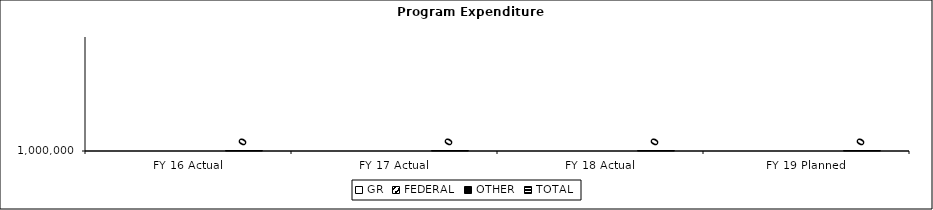
| Category | GR | FEDERAL | OTHER | TOTAL |
|---|---|---|---|---|
| FY 16 Actual |  |  |  | 0 |
| FY 17 Actual |  |  |  | 0 |
| FY 18 Actual |  |  |  | 0 |
| FY 19 Planned |  |  |  | 0 |